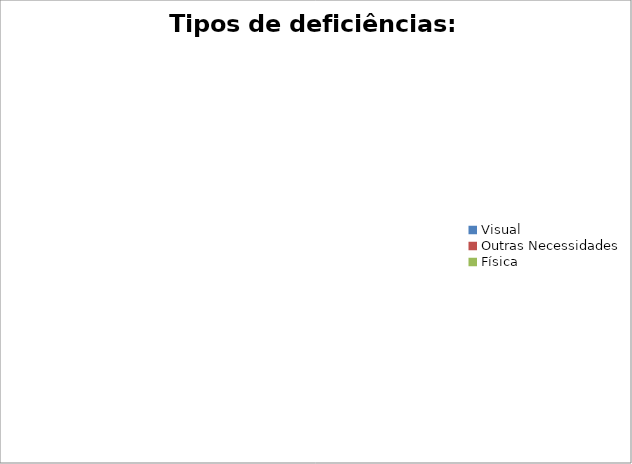
| Category | Tipos de deficiências: Quantitativo |
|---|---|
| Visual | 0 |
| Outras Necessidades | 0 |
| Física | 0 |